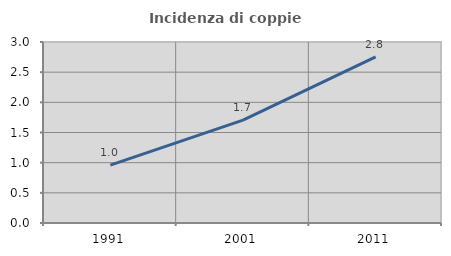
| Category | Incidenza di coppie miste |
|---|---|
| 1991.0 | 0.959 |
| 2001.0 | 1.704 |
| 2011.0 | 2.755 |